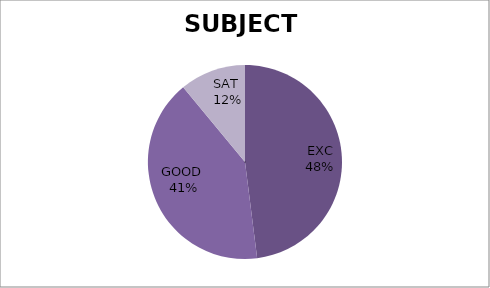
| Category | Series 0 |
|---|---|
| EXC | 48 |
| GOOD  | 41 |
| SAT  | 11 |